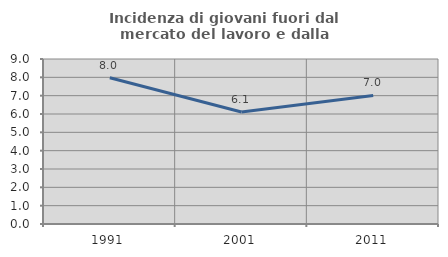
| Category | Incidenza di giovani fuori dal mercato del lavoro e dalla formazione  |
|---|---|
| 1991.0 | 7.974 |
| 2001.0 | 6.111 |
| 2011.0 | 7.013 |